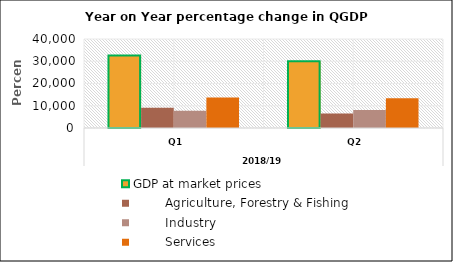
| Category | GDP at market prices |         Agriculture, Forestry & Fishing |         Industry |         Services |
|---|---|---|---|---|
| 0 | 32560.178 | 9047.113 | 7779.587 | 13754.48 |
| 1 | 30033.398 | 6523.155 | 8068.141 | 13368.952 |